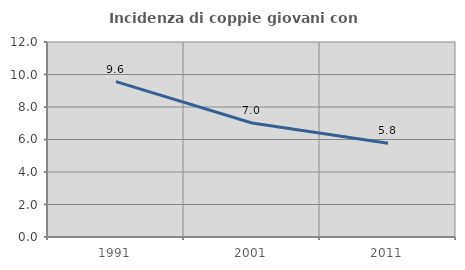
| Category | Incidenza di coppie giovani con figli |
|---|---|
| 1991.0 | 9.559 |
| 2001.0 | 7.013 |
| 2011.0 | 5.772 |